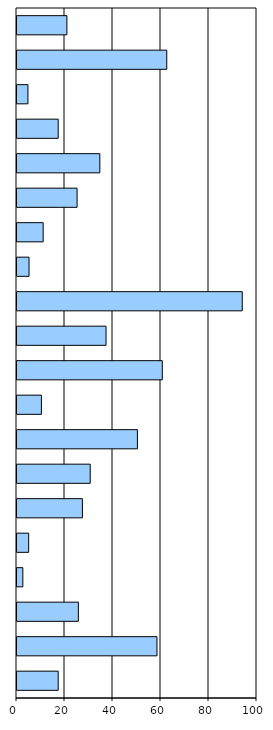
| Category | Series 0 |
|---|---|
| 0 | 17.172 |
| 1 | 58.325 |
| 2 | 25.567 |
| 3 | 2.43 |
| 4 | 4.867 |
| 5 | 27.257 |
| 6 | 30.511 |
| 7 | 50.169 |
| 8 | 10.174 |
| 9 | 60.542 |
| 10 | 37.1 |
| 11 | 93.86 |
| 12 | 5.017 |
| 13 | 10.905 |
| 14 | 25.039 |
| 15 | 34.514 |
| 16 | 17.168 |
| 17 | 4.555 |
| 18 | 62.402 |
| 19 | 20.791 |